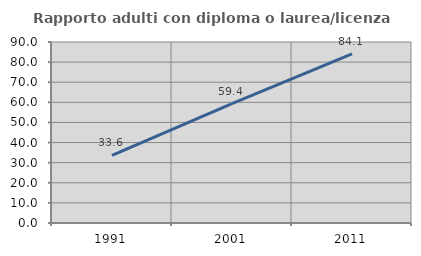
| Category | Rapporto adulti con diploma o laurea/licenza media  |
|---|---|
| 1991.0 | 33.608 |
| 2001.0 | 59.375 |
| 2011.0 | 84.089 |